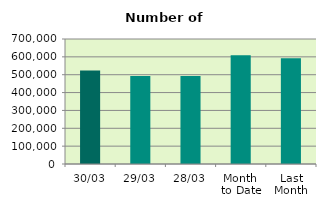
| Category | Series 0 |
|---|---|
| 30/03 | 523774 |
| 29/03 | 492348 |
| 28/03 | 493104 |
| Month 
to Date | 609584.909 |
| Last
Month | 592303 |